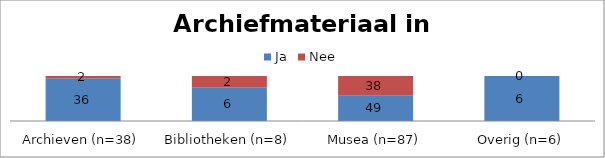
| Category | Ja | Nee |
|---|---|---|
| Archieven (n=38) | 36 | 2 |
| Bibliotheken (n=8) | 6 | 2 |
| Musea (n=87) | 49 | 38 |
| Overig (n=6) | 6 | 0 |